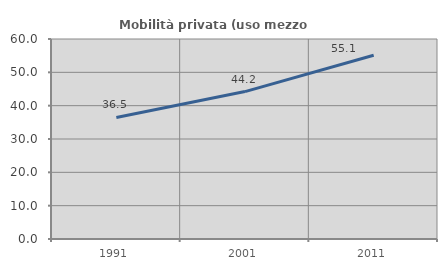
| Category | Mobilità privata (uso mezzo privato) |
|---|---|
| 1991.0 | 36.466 |
| 2001.0 | 44.227 |
| 2011.0 | 55.129 |